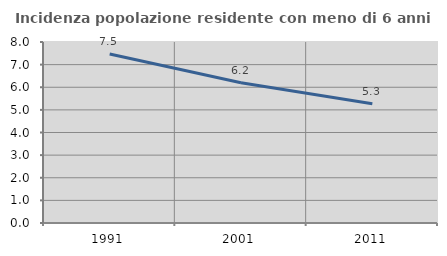
| Category | Incidenza popolazione residente con meno di 6 anni |
|---|---|
| 1991.0 | 7.468 |
| 2001.0 | 6.199 |
| 2011.0 | 5.272 |